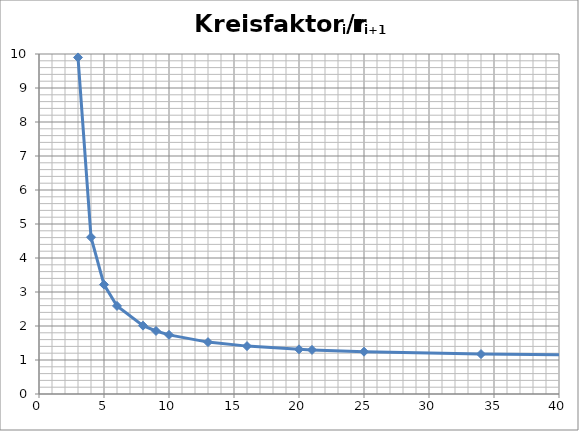
| Category | Kreisfaktor |
|---|---|
| 3.0 | 9.899 |
| 4.0 | 4.612 |
| 5.0 | 3.217 |
| 6.0 | 2.59 |
| 8.0 | 2.011 |
| 9.0 | 1.854 |
| 10.0 | 1.739 |
| 13.0 | 1.526 |
| 16.0 | 1.408 |
| 20.0 | 1.314 |
| 21.0 | 1.297 |
| 25.0 | 1.244 |
| 34.0 | 1.174 |
| 50.0 | 1.115 |
| 55.0 | 1.104 |
| 89.0 | 1.063 |
| 144.0 | 1.039 |